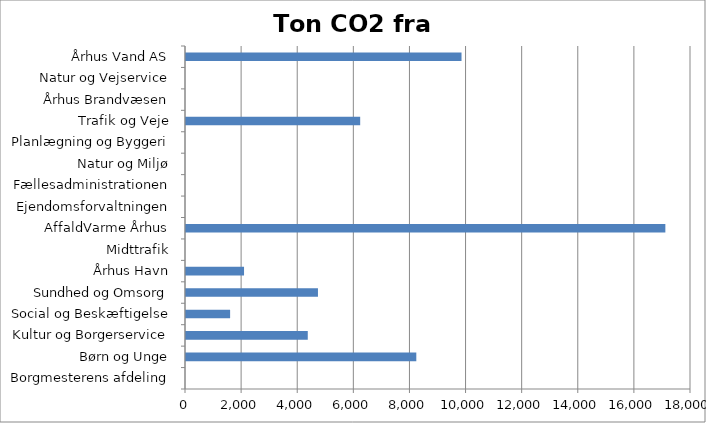
| Category | Ton CO2 |
|---|---|
| Borgmesterens afdeling | 0 |
| Børn og Unge | 8208.922 |
| Kultur og Borgerservice | 4340.311 |
| Social og Beskæftigelse | 1572.382 |
| Sundhed og Omsorg | 4703.632 |
| Århus Havn | 2068.782 |
| Midttrafik | 0 |
| AffaldVarme Århus | 17085.961 |
| Ejendomsforvaltningen | 0 |
| Fællesadministrationen | 0 |
| Natur og Miljø | 0 |
| Planlægning og Byggeri | 0 |
| Trafik og Veje | 6208.786 |
| Århus Brandvæsen | 0 |
| Natur og Vejservice | 0 |
| Århus Vand AS | 9820.585 |